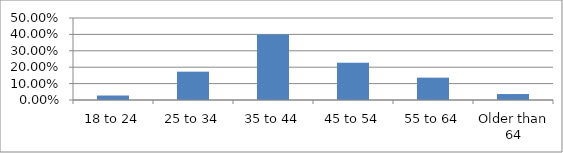
| Category | Series 0 |
|---|---|
| 18 to 24 | 0.027 |
| 25 to 34 | 0.173 |
| 35 to 44 | 0.4 |
| 45 to 54 | 0.227 |
| 55 to 64 | 0.136 |
| Older than 64 | 0.036 |